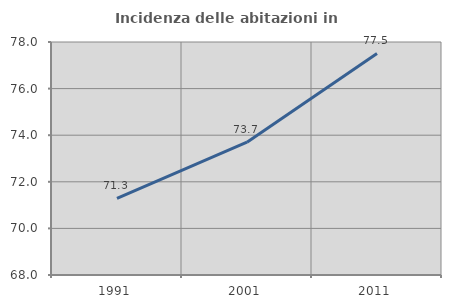
| Category | Incidenza delle abitazioni in proprietà  |
|---|---|
| 1991.0 | 71.293 |
| 2001.0 | 73.7 |
| 2011.0 | 77.507 |